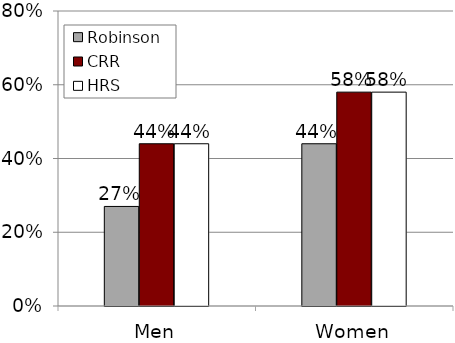
| Category | Robinson | CRR  | HRS |
|---|---|---|---|
| Men | 0.27 | 0.44 | 0.44 |
| Women | 0.44 | 0.58 | 0.58 |